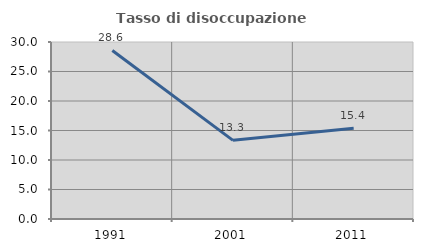
| Category | Tasso di disoccupazione giovanile  |
|---|---|
| 1991.0 | 28.571 |
| 2001.0 | 13.333 |
| 2011.0 | 15.385 |